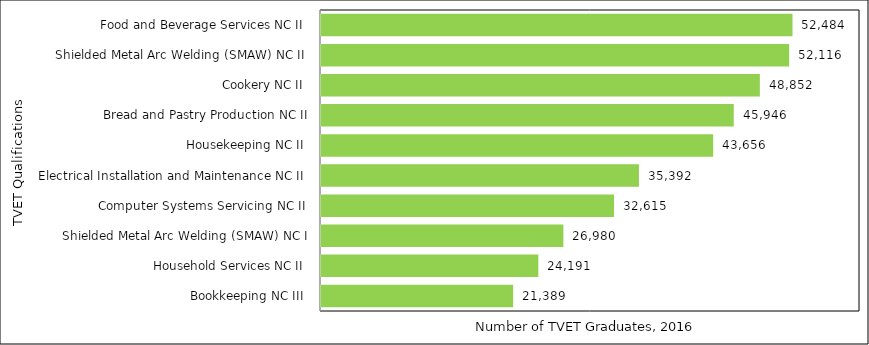
| Category | TOTAL |
|---|---|
| Bookkeeping NC III | 21389 |
| Household Services NC II | 24191 |
| Shielded Metal Arc Welding (SMAW) NC I | 26980 |
| Computer Systems Servicing NC II | 32615 |
| Electrical Installation and Maintenance NC II | 35392 |
| Housekeeping NC II | 43656 |
| Bread and Pastry Production NC II | 45946 |
| Cookery NC II | 48852 |
| Shielded Metal Arc Welding (SMAW) NC II | 52116 |
| Food and Beverage Services NC II | 52484 |